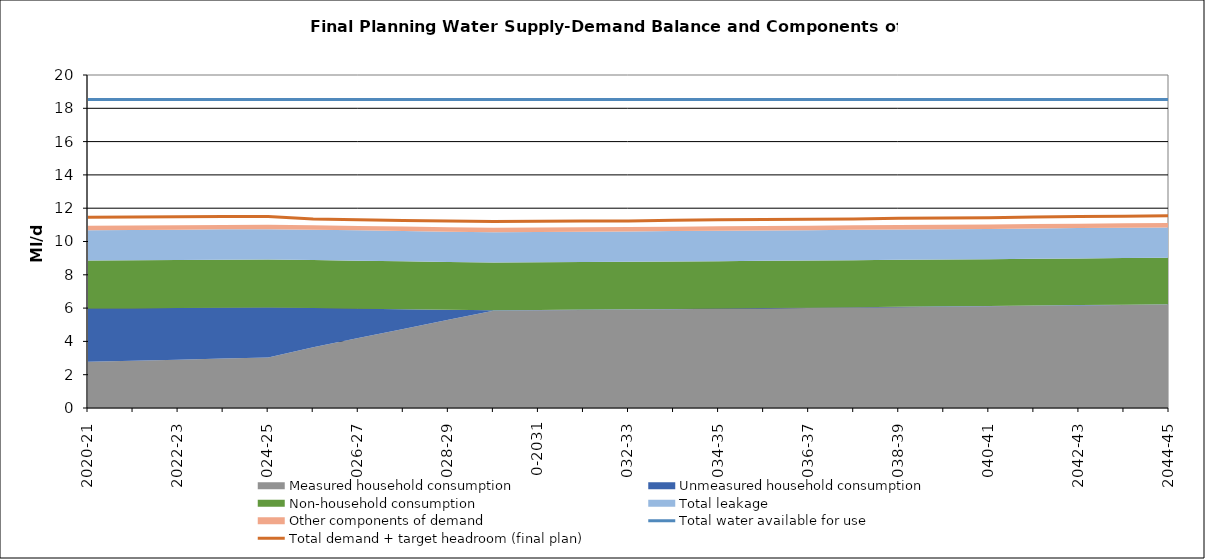
| Category | Total water available for use | Total demand + target headroom (final plan) |
|---|---|---|
| 0 | 18.524 | 11.461 |
| 1 | 18.524 | 11.467 |
| 2 | 18.524 | 11.481 |
| 3 | 18.524 | 11.494 |
| 4 | 18.524 | 11.494 |
| 5 | 18.524 | 11.357 |
| 6 | 18.524 | 11.307 |
| 7 | 18.524 | 11.268 |
| 8 | 18.524 | 11.238 |
| 9 | 18.524 | 11.205 |
| 10 | 18.524 | 11.218 |
| 11 | 18.524 | 11.229 |
| 12 | 18.524 | 11.236 |
| 13 | 18.524 | 11.275 |
| 14 | 18.524 | 11.304 |
| 15 | 18.524 | 11.317 |
| 16 | 18.524 | 11.337 |
| 17 | 18.524 | 11.358 |
| 18 | 18.524 | 11.394 |
| 19 | 18.524 | 11.407 |
| 20 | 18.524 | 11.429 |
| 21 | 18.524 | 11.478 |
| 22 | 18.524 | 11.501 |
| 23 | 18.524 | 11.523 |
| 24 | 18.524 | 11.545 |